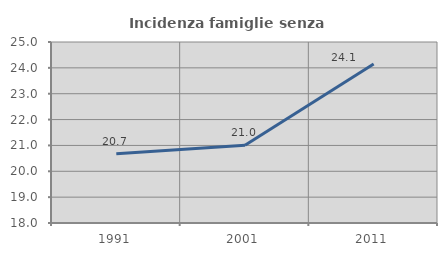
| Category | Incidenza famiglie senza nuclei |
|---|---|
| 1991.0 | 20.682 |
| 2001.0 | 21.01 |
| 2011.0 | 24.147 |